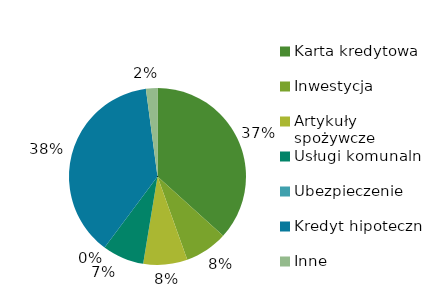
| Category | Suma |
|---|---|
| Karta kredytowa | 936.48 |
| Inwestycja | 200 |
| Artykuły spożywcze | 205.61 |
| Usługi komunalne | 194.2 |
| Ubezpieczenie | 0 |
| Kredyt hipoteczny | 961.77 |
| Inne | 53.65 |